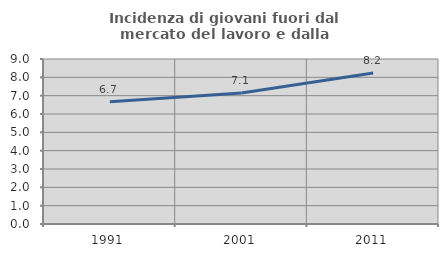
| Category | Incidenza di giovani fuori dal mercato del lavoro e dalla formazione  |
|---|---|
| 1991.0 | 6.667 |
| 2001.0 | 7.143 |
| 2011.0 | 8.242 |